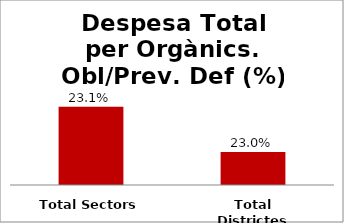
| Category | Series 0 |
|---|---|
| Total Sectors | 0.231 |
| Total Districtes | 0.23 |